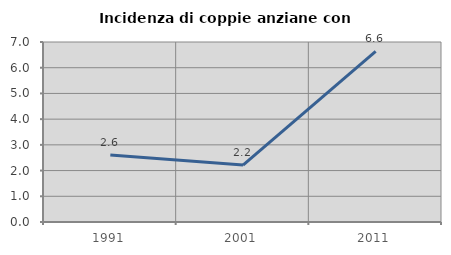
| Category | Incidenza di coppie anziane con figli |
|---|---|
| 1991.0 | 2.609 |
| 2001.0 | 2.212 |
| 2011.0 | 6.635 |